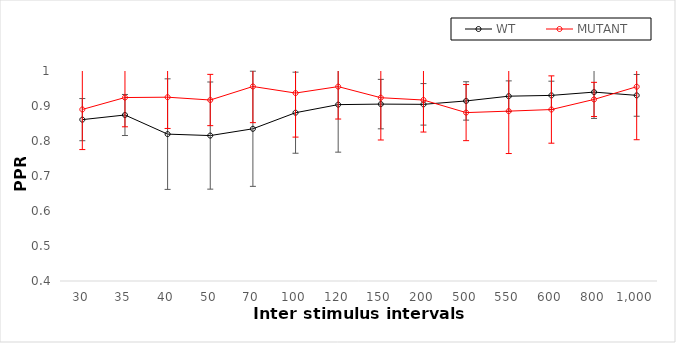
| Category | WT | MUTANT  |
|---|---|---|
| 30.0 | 0.861 | 0.89 |
| 35.0 | 0.874 | 0.924 |
| 40.0 | 0.82 | 0.925 |
| 50.0 | 0.816 | 0.917 |
| 70.0 | 0.835 | 0.956 |
| 100.0 | 0.881 | 0.937 |
| 120.0 | 0.904 | 0.955 |
| 150.0 | 0.905 | 0.924 |
| 200.0 | 0.905 | 0.917 |
| 500.0 | 0.914 | 0.881 |
| 550.0 | 0.928 | 0.885 |
| 600.0 | 0.93 | 0.89 |
| 800.0 | 0.94 | 0.919 |
| 1000.0 | 0.93 | 0.955 |